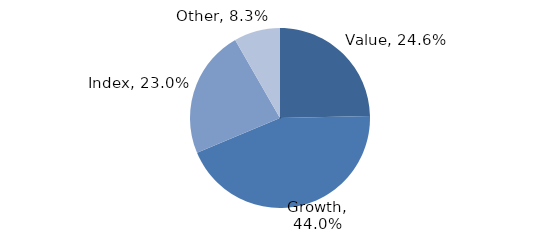
| Category | Investment Style |
|---|---|
| Value | 0.246 |
| Growth | 0.44 |
| Index | 0.23 |
| Other | 0.083 |